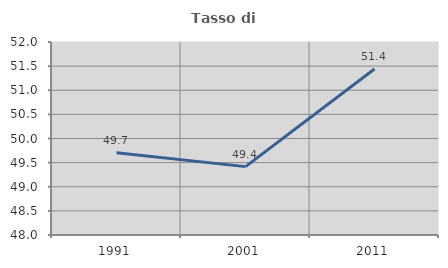
| Category | Tasso di occupazione   |
|---|---|
| 1991.0 | 49.707 |
| 2001.0 | 49.417 |
| 2011.0 | 51.441 |